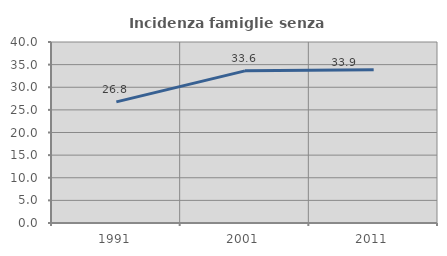
| Category | Incidenza famiglie senza nuclei |
|---|---|
| 1991.0 | 26.776 |
| 2001.0 | 33.624 |
| 2011.0 | 33.891 |